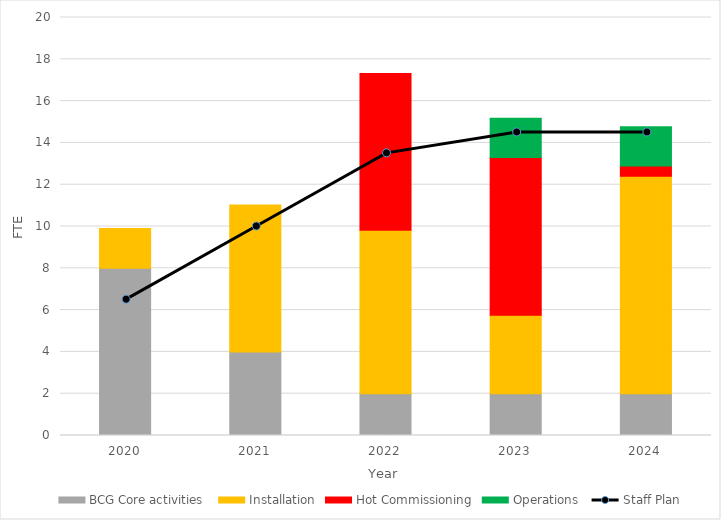
| Category | BCG Core activities  | Installation | Hot Commissioning | Operations  |
|---|---|---|---|---|
| 2020.0 | 8 | 1.9 | 0 | 0 |
| 2021.0 | 4 | 7.025 | 0 | 0 |
| 2022.0 | 2 | 7.825 | 7.5 | 0 |
| 2023.0 | 2 | 3.75 | 7.55 | 1.875 |
| 2024.0 | 2 | 10.4 | 0.5 | 1.875 |